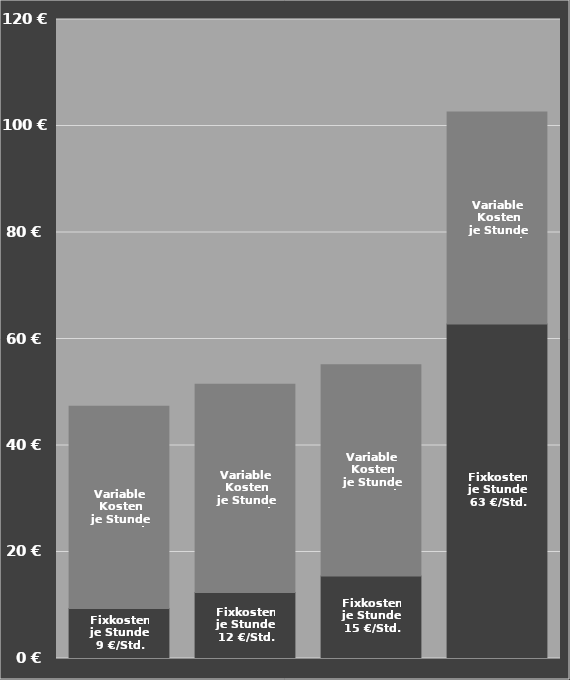
| Category | Fixkosten
je Stunde | Variable Kosten
je Stunde |
|---|---|---|
| Trecker 140 PS | 9.384 | 38 |
| Trecker 200 PS | 12.387 | 39.1 |
| Trecker 250 PS | 15.483 | 39.7 |
| Selbstfahrer | 62.812 | 39.8 |